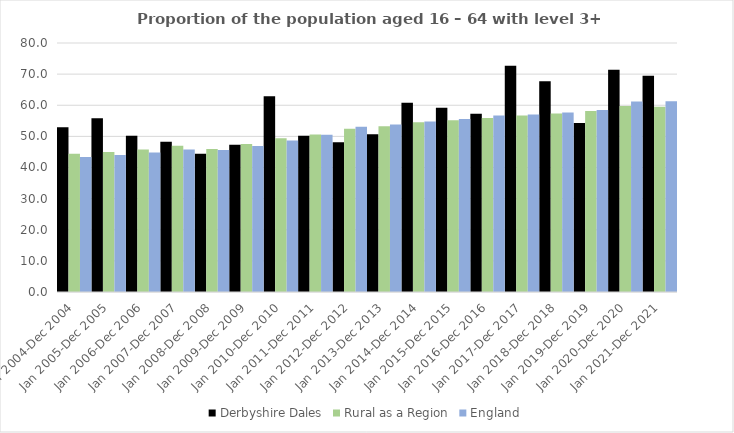
| Category | Derbyshire Dales | Rural as a Region | England |
|---|---|---|---|
| Jan 2004-Dec 2004 | 52.9 | 44.405 | 43.4 |
| Jan 2005-Dec 2005 | 55.8 | 44.973 | 44 |
| Jan 2006-Dec 2006 | 50.2 | 45.774 | 44.8 |
| Jan 2007-Dec 2007 | 48.3 | 46.968 | 45.8 |
| Jan 2008-Dec 2008 | 44.4 | 45.964 | 45.6 |
| Jan 2009-Dec 2009 | 47.3 | 47.59 | 46.9 |
| Jan 2010-Dec 2010 | 62.9 | 49.362 | 48.7 |
| Jan 2011-Dec 2011 | 50.2 | 50.602 | 50.5 |
| Jan 2012-Dec 2012 | 48.1 | 52.439 | 53.1 |
| Jan 2013-Dec 2013 | 50.7 | 53.276 | 53.8 |
| Jan 2014-Dec 2014 | 60.8 | 54.57 | 54.8 |
| Jan 2015-Dec 2015 | 59.2 | 55.16 | 55.6 |
| Jan 2016-Dec 2016 | 57.3 | 55.941 | 56.7 |
| Jan 2017-Dec 2017 | 72.7 | 56.689 | 57 |
| Jan 2018-Dec 2018 | 67.7 | 57.389 | 57.7 |
| Jan 2019-Dec 2019 | 54.3 | 58.147 | 58.5 |
| Jan 2020-Dec 2020 | 71.4 | 59.771 | 61.2 |
| Jan 2021-Dec 2021 | 69.5 | 59.54 | 61.3 |